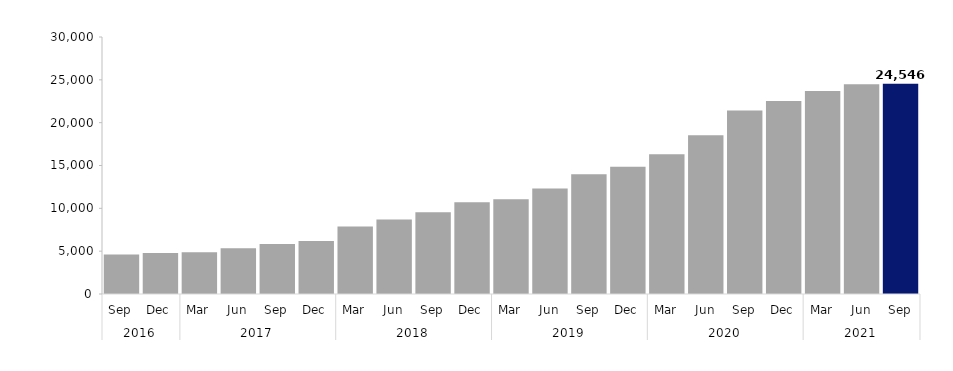
| Category | Series 0 |
|---|---|
| 0 | 4602 |
| 1 | 4773 |
| 2 | 4866 |
| 3 | 5352 |
| 4 | 5844 |
| 5 | 6180 |
| 6 | 7890 |
| 7 | 8703 |
| 8 | 9537 |
| 9 | 10713 |
| 10 | 11067 |
| 11 | 12309 |
| 12 | 13965 |
| 13 | 14868 |
| 14 | 16308 |
| 15 | 18522 |
| 16 | 21414 |
| 17 | 22521 |
| 18 | 23688 |
| 19 | 24474 |
| 20 | 24546 |